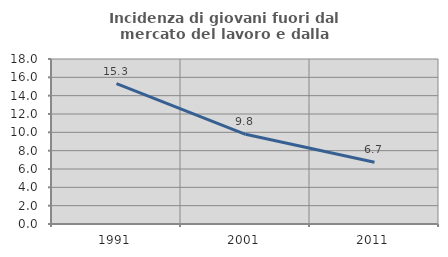
| Category | Incidenza di giovani fuori dal mercato del lavoro e dalla formazione  |
|---|---|
| 1991.0 | 15.309 |
| 2001.0 | 9.787 |
| 2011.0 | 6.742 |